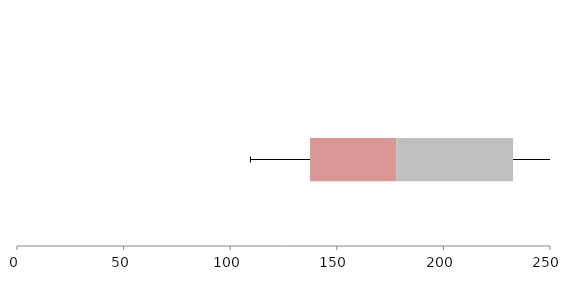
| Category | Series 1 | Series 2 | Series 3 |
|---|---|---|---|
| 0 | 137.451 | 40.441 | 54.784 |